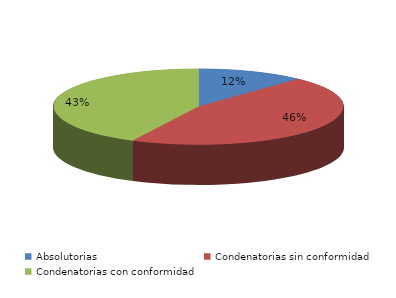
| Category | Series 0 |
|---|---|
| Absolutorias | 12 |
| Condenatorias sin conformidad | 46 |
| Condenatorias con conformidad | 43 |